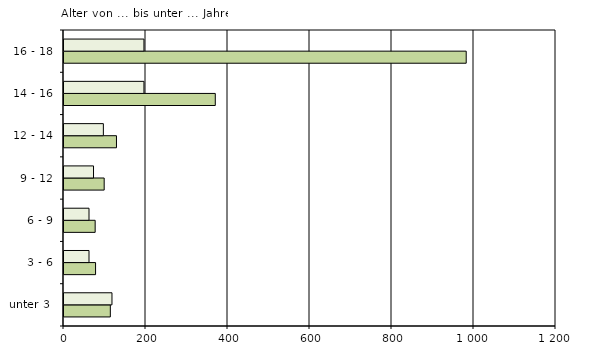
| Category | männlich | weiblich |
|---|---|---|
| unter 3  | 113 | 117 |
| 3 - 6 | 77 | 61 |
| 6 - 9 | 76 | 61 |
| 9 - 12 | 98 | 72 |
| 12 - 14 | 128 | 96 |
| 14 - 16 | 369 | 195 |
| 16 - 18 | 981 | 195 |